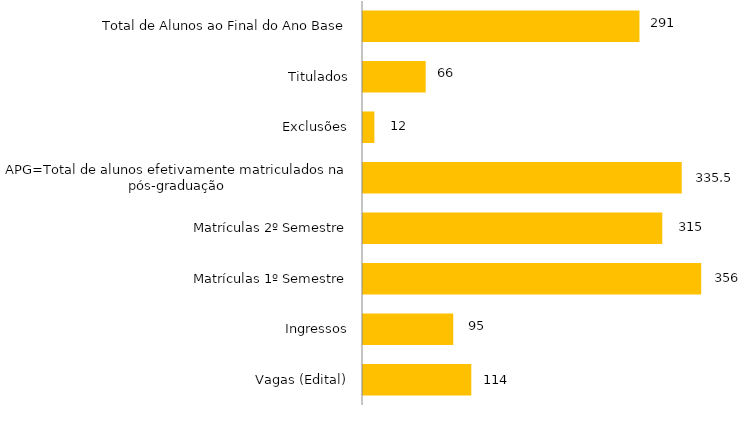
| Category | Curso |
|---|---|
| Vagas (Edital) | 114 |
| Ingressos | 95 |
| Matrículas 1º Semestre | 356 |
| Matrículas 2º Semestre | 315 |
| APG=Total de alunos efetivamente matriculados na pós-graduação | 335.5 |
| Exclusões | 12 |
| Titulados | 66 |
| Total de Alunos ao Final do Ano Base | 291 |